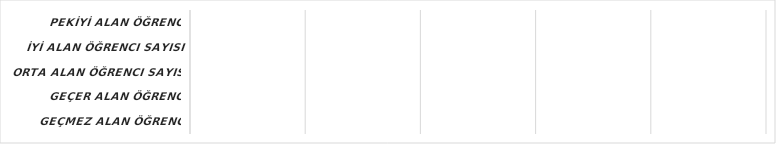
| Category | Series 6 |
|---|---|
| GEÇMEZ alan öğrenci sayısı | 0 |
| GEÇER alan öğrenci sayısı | 0 |
| ORTA alan öğrenci sayısı | 0 |
| İYİ alan öğrenci sayısı | 0 |
| PEKİYİ alan öğrenci sayısı | 0 |